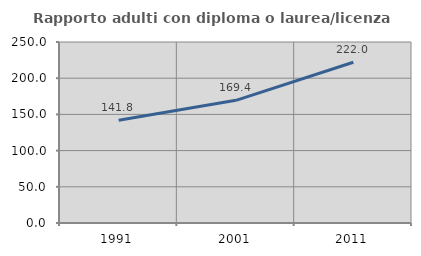
| Category | Rapporto adulti con diploma o laurea/licenza media  |
|---|---|
| 1991.0 | 141.814 |
| 2001.0 | 169.434 |
| 2011.0 | 221.974 |